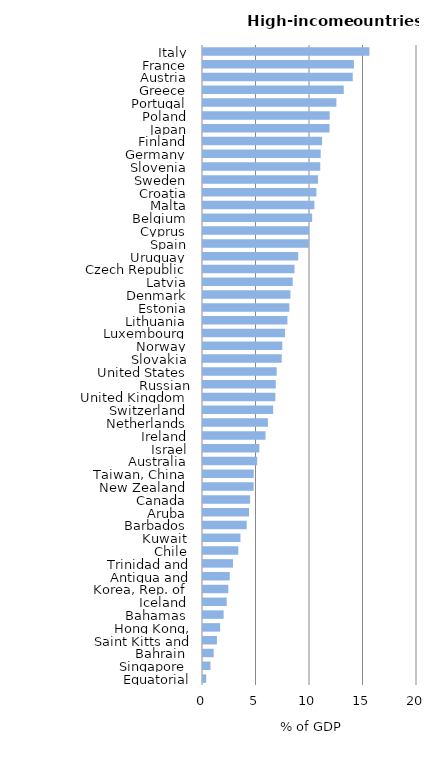
| Category | Series 0 |
|---|---|
| Equatorial Guinea | 0.3 |
| Singapore | 0.699 |
| Bahrain | 1 |
| Saint Kitts and Nevis | 1.3 |
| Hong Kong, China | 1.6 |
| Bahamas | 1.928 |
| Iceland | 2.218 |
| Korea, Rep. of | 2.363 |
| Antigua and Barbuda | 2.5 |
| Trinidad and Tobago | 2.8 |
| Chile | 3.299 |
| Kuwait | 3.5 |
| Barbados | 4.084 |
| Aruba | 4.3 |
| Canada | 4.4 |
| New Zealand | 4.735 |
| Taiwan, China | 4.744 |
| Australia | 5.065 |
| Israel | 5.267 |
| Ireland | 5.844 |
| Netherlands | 6.066 |
| Switzerland | 6.558 |
| United Kingdom | 6.764 |
| Russian Federation | 6.8 |
| United States | 6.885 |
| Slovakia | 7.356 |
| Norway | 7.409 |
| Luxembourg | 7.668 |
| Lithuania | 7.891 |
| Estonia | 8.07 |
| Denmark | 8.171 |
| Latvia | 8.388 |
| Czech Republic | 8.553 |
| Uruguay | 8.9 |
| Spain | 9.884 |
| Cyprus | 9.905 |
| Belgium | 10.199 |
| Malta | 10.41 |
| Croatia | 10.6 |
| Sweden | 10.752 |
| Slovenia | 10.959 |
| Germany | 11.001 |
| Finland | 11.13 |
| Japan | 11.826 |
| Poland | 11.84 |
| Portugal | 12.466 |
| Greece | 13.156 |
| Austria | 13.998 |
| France | 14.105 |
| Italy | 15.557 |